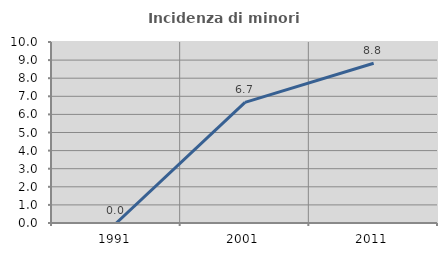
| Category | Incidenza di minori stranieri |
|---|---|
| 1991.0 | 0 |
| 2001.0 | 6.667 |
| 2011.0 | 8.824 |